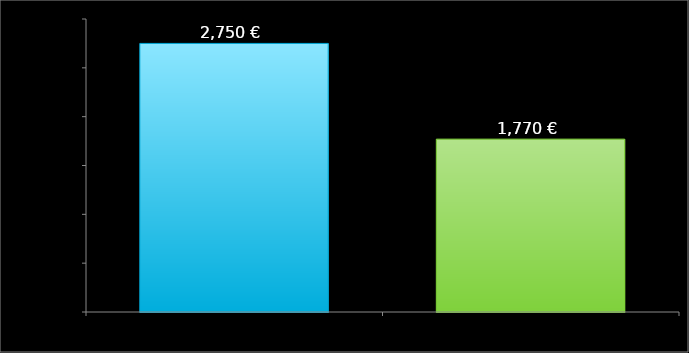
| Category | Datos |
|---|---|
| ingresos | 2750 |
| gastos | 1770 |